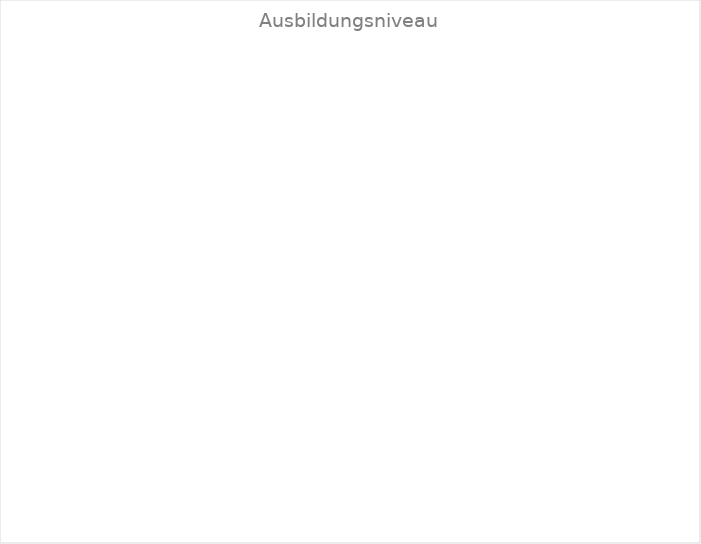
| Category | EFZ | Series 1 |
|---|---|---|
| EFZ | 0 | 0 |
| EBA | 0 | 0 |
| PrA |Praktischer Teil in der Institution | 0 | 0 |
| Ausbildung in der Institutionn | 0 | 0 |
| Ausbildung in Kooperation mit dem 1. AM | 0 | 0 |
| Ausbildung im Lehrverbund des 1. AM | 0 | 0 |
| Suportet Education (Lehrvertrag über Institution) | 0 | 0 |